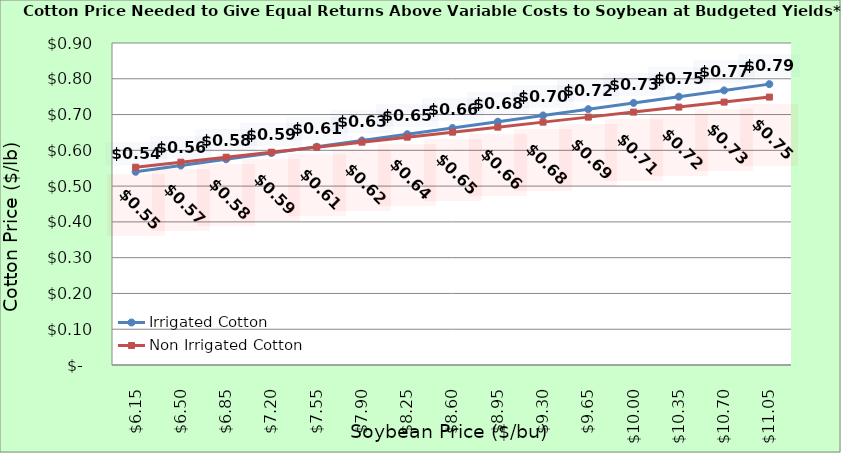
| Category | Irrigated Cotton | Non Irrigated Cotton |
|---|---|---|
| 6.150000000000002 | 0.54 | 0.553 |
| 6.500000000000002 | 0.558 | 0.567 |
| 6.850000000000001 | 0.575 | 0.581 |
| 7.200000000000001 | 0.593 | 0.595 |
| 7.550000000000001 | 0.61 | 0.609 |
| 7.9 | 0.628 | 0.623 |
| 8.25 | 0.645 | 0.637 |
| 8.6 | 0.663 | 0.651 |
| 8.95 | 0.68 | 0.665 |
| 9.299999999999999 | 0.698 | 0.679 |
| 9.649999999999999 | 0.715 | 0.693 |
| 9.999999999999998 | 0.733 | 0.707 |
| 10.349999999999998 | 0.75 | 0.721 |
| 10.699999999999998 | 0.768 | 0.735 |
| 11.049999999999997 | 0.785 | 0.749 |